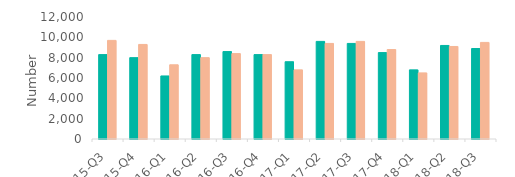
| Category | First-time
buyers | Home movers |
|---|---|---|
| 15-Q3 | 8300 | 9700 |
| 15-Q4 | 8000 | 9300 |
| 16-Q1 | 6200 | 7300 |
| 16-Q2 | 8300 | 8000 |
| 16-Q3 | 8600 | 8400 |
| 16-Q4 | 8300 | 8300 |
| 17-Q1 | 7600 | 6800 |
| 17-Q2 | 9600 | 9400 |
| 17-Q3 | 9400 | 9600 |
| 17-Q4 | 8500 | 8800 |
| 18-Q1 | 6800 | 6500 |
| 18-Q2 | 9200 | 9100 |
| 18-Q3 | 8900 | 9500 |